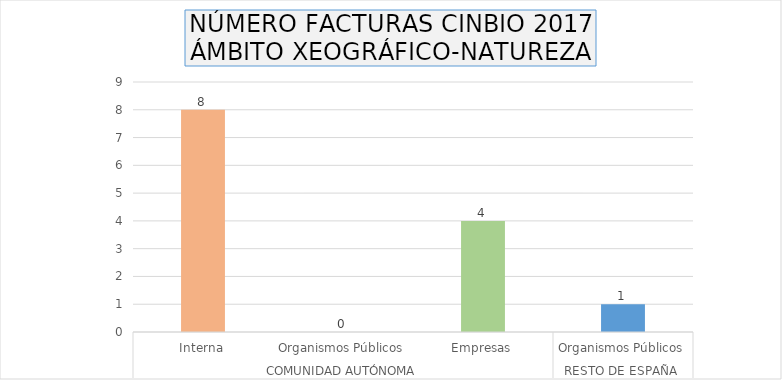
| Category | Series 0 |
|---|---|
| 0 | 8 |
| 1 | 0 |
| 2 | 4 |
| 3 | 1 |